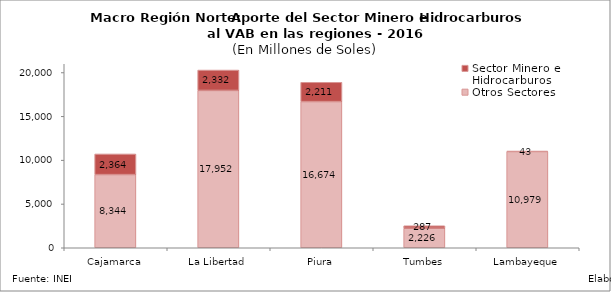
| Category | Otros Sectores | Sector Minero e Hidrocarburos |
|---|---|---|
| Cajamarca | 8344.136 | 2364.205 |
| La Libertad | 17951.748 | 2331.681 |
| Piura | 16674.083 | 2210.764 |
| Tumbes | 2226.483 | 286.927 |
| Lambayeque | 10979.201 | 42.911 |